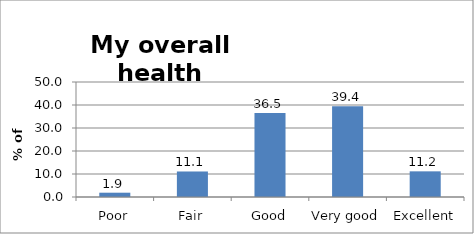
| Category | Series 0 |
|---|---|
| Poor | 1.869 |
| Fair | 11.095 |
| Good | 36.475 |
| Very good | 39.405 |
| Excellent | 11.155 |